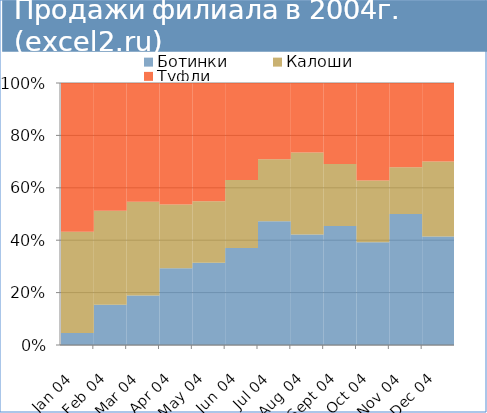
| Category | Ботинки | Калоши | Туфли |
|---|---|---|---|
| 2004-01-01 | 2 | 17 | 25 |
| 2004-02-01 | 6 | 14 | 19 |
| 2004-03-01 | 10 | 19 | 24 |
| 2004-04-01 | 12 | 10 | 19 |
| 2004-05-01 | 16 | 12 | 23 |
| 2004-06-01 | 20 | 14 | 20 |
| 2004-07-01 | 26 | 13 | 16 |
| 2004-08-01 | 27 | 20 | 17 |
| 2004-09-01 | 25 | 13 | 17 |
| 2004-10-01 | 20 | 12 | 19 |
| 2004-11-01 | 28 | 10 | 18 |
| 2004-12-01 | 29 | 20 | 21 |